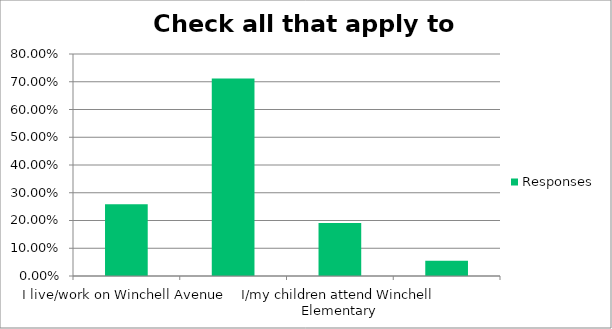
| Category | Responses |
|---|---|
| I live/work on Winchell Avenue | 0.259 |
| I live in the Oakland Drive Winchell Neighborhood. | 0.712 |
| I/my children attend Winchell Elementary | 0.191 |
| None of the above | 0.055 |